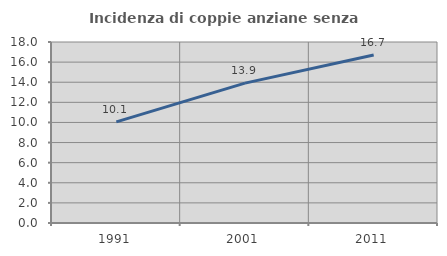
| Category | Incidenza di coppie anziane senza figli  |
|---|---|
| 1991.0 | 10.061 |
| 2001.0 | 13.908 |
| 2011.0 | 16.704 |